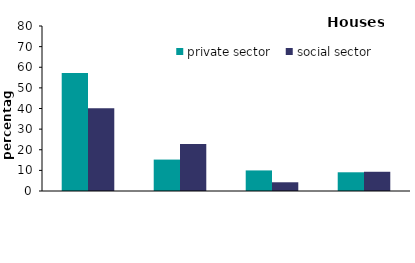
| Category | private sector | social sector |
|---|---|---|
| masonry cavity wall, pointed brickwork | 57.22 | 40.169 |
| masonry solid wall, pointed brickwork | 15.234 | 22.733 |
| masonry cavity wall, rendered finish | 9.977 | 4.23 |
| masonry soild wall, rendered finish | 9.072 | 9.323 |